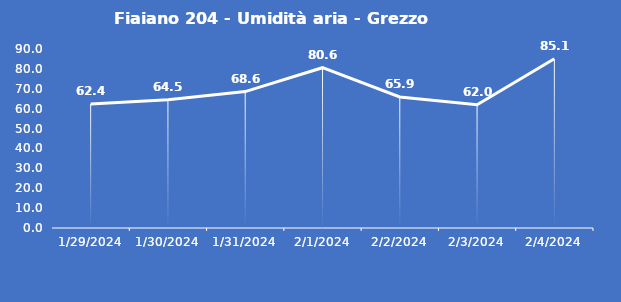
| Category | Fiaiano 204 - Umidità aria - Grezzo (%) |
|---|---|
| 1/29/24 | 62.4 |
| 1/30/24 | 64.5 |
| 1/31/24 | 68.6 |
| 2/1/24 | 80.6 |
| 2/2/24 | 65.9 |
| 2/3/24 | 62 |
| 2/4/24 | 85.1 |